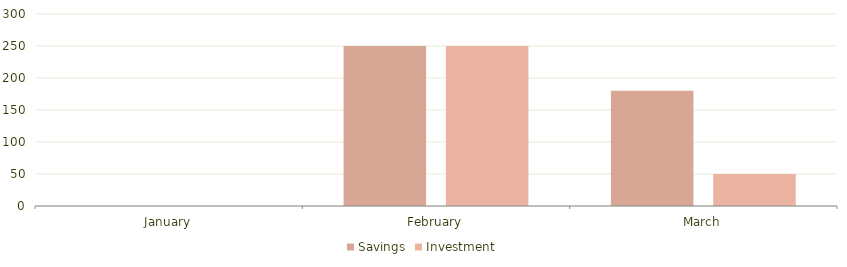
| Category | Savings | Investment |
|---|---|---|
| January | 0 | 0 |
| February | 250 | 250 |
| March | 180 | 50 |